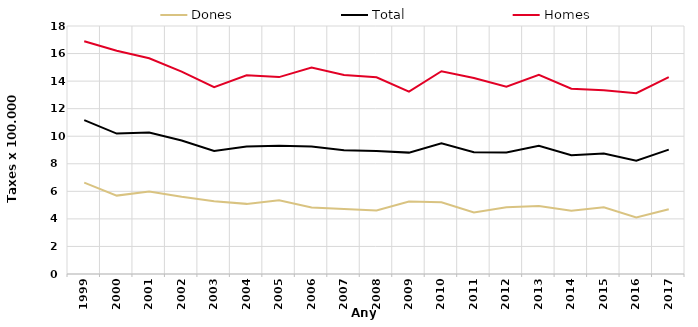
| Category | Dones | Total | Homes |
|---|---|---|---|
| 1999.0 | 6.63 | 11.17 | 16.89 |
| 2000.0 | 5.69 | 10.19 | 16.2 |
| 2001.0 | 5.99 | 10.27 | 15.66 |
| 2002.0 | 5.6 | 9.69 | 14.69 |
| 2003.0 | 5.28 | 8.93 | 13.56 |
| 2004.0 | 5.09 | 9.25 | 14.42 |
| 2005.0 | 5.35 | 9.3 | 14.29 |
| 2006.0 | 4.82 | 9.26 | 14.98 |
| 2007.0 | 4.72 | 8.99 | 14.44 |
| 2008.0 | 4.61 | 8.93 | 14.28 |
| 2009.0 | 5.26 | 8.81 | 13.24 |
| 2010.0 | 5.2 | 9.49 | 14.72 |
| 2011.0 | 4.47 | 8.84 | 14.22 |
| 2012.0 | 4.84 | 8.82 | 13.6 |
| 2013.0 | 4.94 | 9.31 | 14.46 |
| 2014.0 | 4.59 | 8.62 | 13.45 |
| 2015.0 | 4.84 | 8.74 | 13.33 |
| 2016.0 | 4.11 | 8.23 | 13.12 |
| 2017.0 | 4.7 | 9.03 | 14.29 |